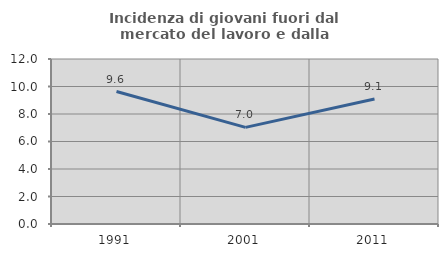
| Category | Incidenza di giovani fuori dal mercato del lavoro e dalla formazione  |
|---|---|
| 1991.0 | 9.635 |
| 2001.0 | 7.026 |
| 2011.0 | 9.097 |